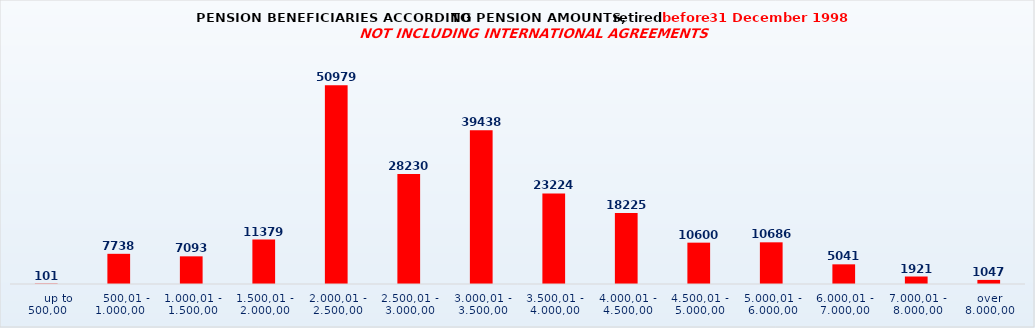
| Category | Series 0 |
|---|---|
|      up to 500,00 | 101 |
|    500,01 - 1.000,00 | 7738 |
| 1.000,01 - 1.500,00 | 7093 |
| 1.500,01 - 2.000,00 | 11379 |
| 2.000,01 - 2.500,00 | 50979 |
| 2.500,01 - 3.000,00 | 28230 |
| 3.000,01 - 3.500,00 | 39438 |
| 3.500,01 - 4.000,00 | 23224 |
| 4.000,01 - 4.500,00 | 18225 |
| 4.500,01 - 5.000,00 | 10600 |
| 5.000,01 - 6.000,00 | 10686 |
| 6.000,01 - 7.000,00 | 5041 |
| 7.000,01 - 8.000,00 | 1921 |
| over 8.000,00 | 1047 |